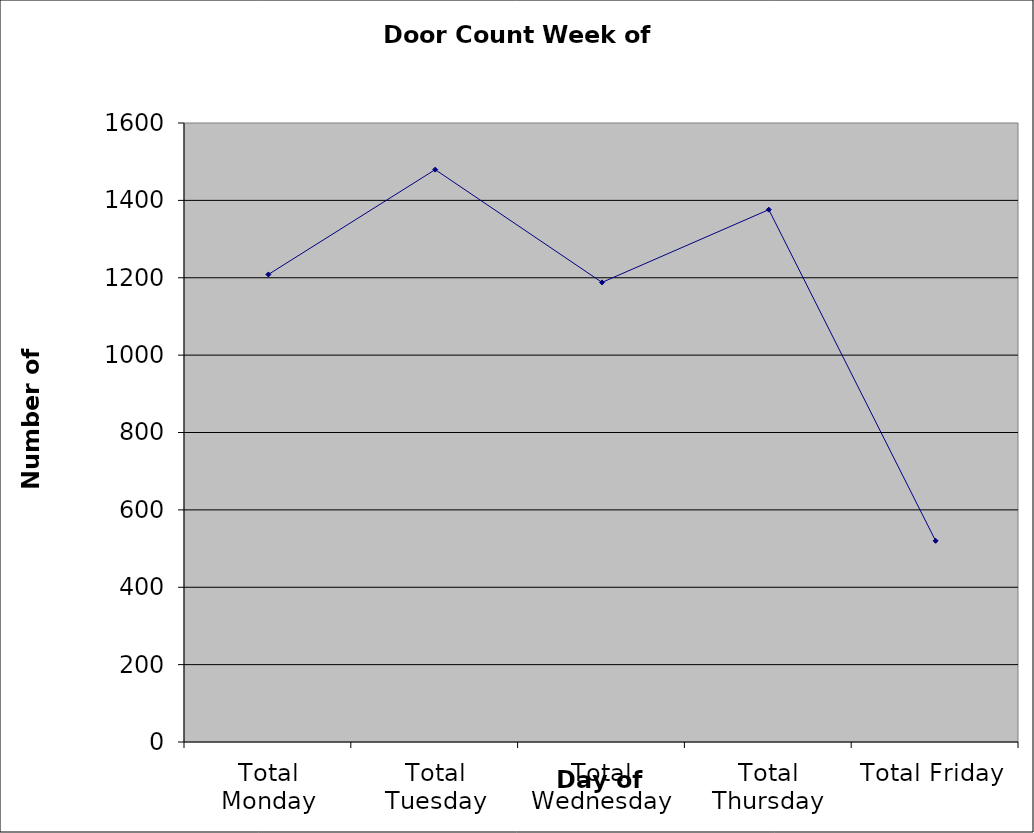
| Category | Series 0 |
|---|---|
| Total Monday | 1208.5 |
| Total Tuesday | 1479.5 |
| Total Wednesday | 1188 |
| Total Thursday | 1376 |
| Total Friday | 520 |